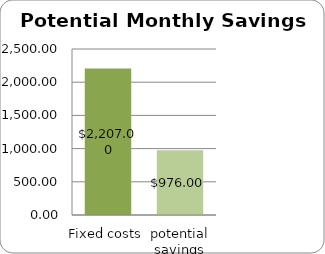
| Category | Series 0 |
|---|---|
| Fixed costs | 2207 |
| potential savings | 976 |